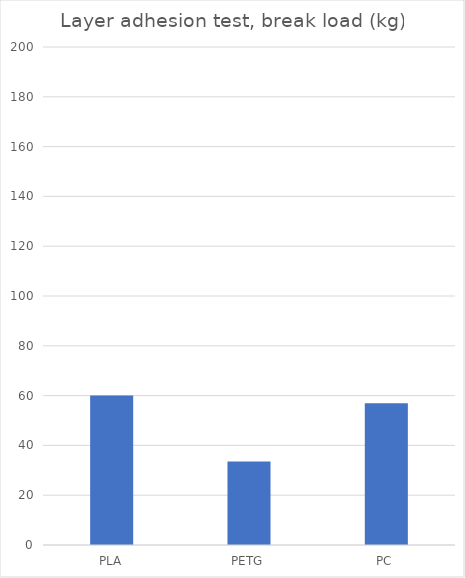
| Category | Average |
|---|---|
| PLA | 60 |
| PETG | 33.5 |
| PC | 56.9 |